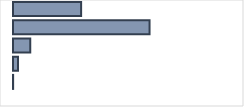
| Category | Series 0 |
|---|---|
| 0 | 30.009 |
| 1 | 60.154 |
| 2 | 7.609 |
| 3 | 2.174 |
| 4 | 0.055 |